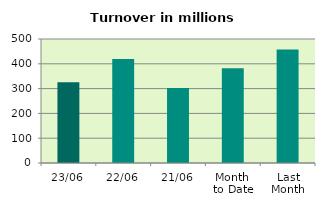
| Category | Series 0 |
|---|---|
| 23/06 | 325.369 |
| 22/06 | 419.013 |
| 21/06 | 302.287 |
| Month 
to Date | 382.556 |
| Last
Month | 457.674 |